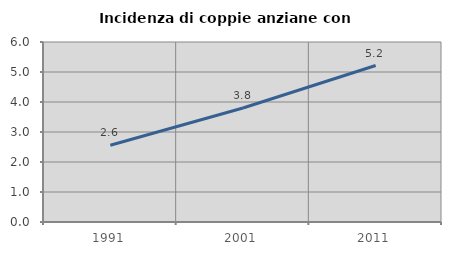
| Category | Incidenza di coppie anziane con figli |
|---|---|
| 1991.0 | 2.56 |
| 2001.0 | 3.8 |
| 2011.0 | 5.217 |